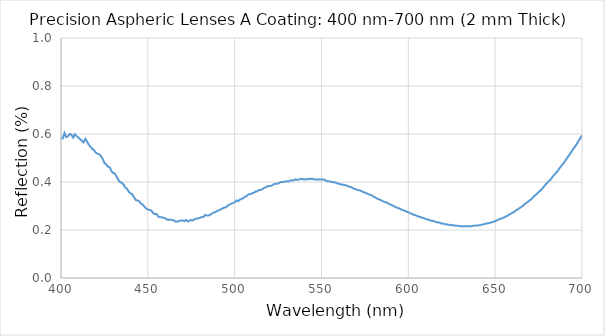
| Category | Reflection |
|---|---|
| 700.0 | 0.594 |
| 699.0 | 0.582 |
| 698.0 | 0.571 |
| 697.0 | 0.558 |
| 696.0 | 0.548 |
| 695.0 | 0.538 |
| 694.0 | 0.527 |
| 693.0 | 0.516 |
| 692.0 | 0.506 |
| 691.0 | 0.496 |
| 690.0 | 0.484 |
| 689.0 | 0.475 |
| 688.0 | 0.466 |
| 687.0 | 0.457 |
| 686.0 | 0.446 |
| 685.0 | 0.438 |
| 684.0 | 0.43 |
| 683.0 | 0.421 |
| 682.0 | 0.411 |
| 681.0 | 0.404 |
| 680.0 | 0.397 |
| 679.0 | 0.389 |
| 678.0 | 0.38 |
| 677.0 | 0.372 |
| 676.0 | 0.364 |
| 675.0 | 0.358 |
| 674.0 | 0.35 |
| 673.0 | 0.345 |
| 672.0 | 0.337 |
| 671.0 | 0.33 |
| 670.0 | 0.324 |
| 669.0 | 0.318 |
| 668.0 | 0.313 |
| 667.0 | 0.308 |
| 666.0 | 0.301 |
| 665.0 | 0.296 |
| 664.0 | 0.291 |
| 663.0 | 0.286 |
| 662.0 | 0.282 |
| 661.0 | 0.276 |
| 660.0 | 0.272 |
| 659.0 | 0.268 |
| 658.0 | 0.264 |
| 657.0 | 0.259 |
| 656.0 | 0.256 |
| 655.0 | 0.252 |
| 654.0 | 0.249 |
| 653.0 | 0.246 |
| 652.0 | 0.244 |
| 651.0 | 0.24 |
| 650.0 | 0.237 |
| 649.0 | 0.234 |
| 648.0 | 0.232 |
| 647.0 | 0.23 |
| 646.0 | 0.228 |
| 645.0 | 0.227 |
| 644.0 | 0.225 |
| 643.0 | 0.223 |
| 642.0 | 0.222 |
| 641.0 | 0.22 |
| 640.0 | 0.219 |
| 639.0 | 0.219 |
| 638.0 | 0.218 |
| 637.0 | 0.217 |
| 636.0 | 0.216 |
| 635.0 | 0.216 |
| 634.0 | 0.216 |
| 633.0 | 0.216 |
| 632.0 | 0.216 |
| 631.0 | 0.216 |
| 630.0 | 0.216 |
| 629.0 | 0.217 |
| 628.0 | 0.218 |
| 627.0 | 0.218 |
| 626.0 | 0.22 |
| 625.0 | 0.22 |
| 624.0 | 0.221 |
| 623.0 | 0.222 |
| 622.0 | 0.224 |
| 621.0 | 0.224 |
| 620.0 | 0.227 |
| 619.0 | 0.227 |
| 618.0 | 0.231 |
| 617.0 | 0.231 |
| 616.0 | 0.233 |
| 615.0 | 0.236 |
| 614.0 | 0.238 |
| 613.0 | 0.239 |
| 612.0 | 0.242 |
| 611.0 | 0.244 |
| 610.0 | 0.246 |
| 609.0 | 0.249 |
| 608.0 | 0.251 |
| 607.0 | 0.254 |
| 606.0 | 0.256 |
| 605.0 | 0.258 |
| 604.0 | 0.262 |
| 603.0 | 0.264 |
| 602.0 | 0.267 |
| 601.0 | 0.27 |
| 600.0 | 0.274 |
| 599.0 | 0.276 |
| 598.0 | 0.28 |
| 597.0 | 0.282 |
| 596.0 | 0.285 |
| 595.0 | 0.289 |
| 594.0 | 0.292 |
| 593.0 | 0.294 |
| 592.0 | 0.298 |
| 591.0 | 0.302 |
| 590.0 | 0.305 |
| 589.0 | 0.308 |
| 588.0 | 0.313 |
| 587.0 | 0.315 |
| 586.0 | 0.318 |
| 585.0 | 0.321 |
| 584.0 | 0.325 |
| 583.0 | 0.328 |
| 582.0 | 0.331 |
| 581.0 | 0.335 |
| 580.0 | 0.339 |
| 579.0 | 0.344 |
| 578.0 | 0.347 |
| 577.0 | 0.349 |
| 576.0 | 0.353 |
| 575.0 | 0.356 |
| 574.0 | 0.358 |
| 573.0 | 0.362 |
| 572.0 | 0.365 |
| 571.0 | 0.366 |
| 570.0 | 0.369 |
| 569.0 | 0.371 |
| 568.0 | 0.375 |
| 567.0 | 0.379 |
| 566.0 | 0.38 |
| 565.0 | 0.384 |
| 564.0 | 0.386 |
| 563.0 | 0.387 |
| 562.0 | 0.39 |
| 561.0 | 0.39 |
| 560.0 | 0.393 |
| 559.0 | 0.394 |
| 558.0 | 0.398 |
| 557.0 | 0.399 |
| 556.0 | 0.4 |
| 555.0 | 0.402 |
| 554.0 | 0.403 |
| 553.0 | 0.404 |
| 552.0 | 0.409 |
| 551.0 | 0.41 |
| 550.0 | 0.41 |
| 549.0 | 0.411 |
| 548.0 | 0.41 |
| 547.0 | 0.411 |
| 546.0 | 0.41 |
| 545.0 | 0.413 |
| 544.0 | 0.412 |
| 543.0 | 0.414 |
| 542.0 | 0.411 |
| 541.0 | 0.412 |
| 540.0 | 0.41 |
| 539.0 | 0.412 |
| 538.0 | 0.413 |
| 537.0 | 0.41 |
| 536.0 | 0.409 |
| 535.0 | 0.411 |
| 534.0 | 0.407 |
| 533.0 | 0.407 |
| 532.0 | 0.406 |
| 531.0 | 0.402 |
| 530.0 | 0.403 |
| 529.0 | 0.402 |
| 528.0 | 0.4 |
| 527.0 | 0.4 |
| 526.0 | 0.398 |
| 525.0 | 0.393 |
| 524.0 | 0.393 |
| 523.0 | 0.392 |
| 522.0 | 0.388 |
| 521.0 | 0.384 |
| 520.0 | 0.383 |
| 519.0 | 0.383 |
| 518.0 | 0.378 |
| 517.0 | 0.376 |
| 516.0 | 0.37 |
| 515.0 | 0.367 |
| 514.0 | 0.367 |
| 513.0 | 0.361 |
| 512.0 | 0.36 |
| 511.0 | 0.355 |
| 510.0 | 0.353 |
| 509.0 | 0.349 |
| 508.0 | 0.349 |
| 507.0 | 0.342 |
| 506.0 | 0.339 |
| 505.0 | 0.333 |
| 504.0 | 0.329 |
| 503.0 | 0.327 |
| 502.0 | 0.32 |
| 501.0 | 0.323 |
| 500.0 | 0.316 |
| 499.0 | 0.312 |
| 498.0 | 0.309 |
| 497.0 | 0.306 |
| 496.0 | 0.301 |
| 495.0 | 0.295 |
| 494.0 | 0.293 |
| 493.0 | 0.29 |
| 492.0 | 0.286 |
| 491.0 | 0.282 |
| 490.0 | 0.28 |
| 489.0 | 0.275 |
| 488.0 | 0.273 |
| 487.0 | 0.269 |
| 486.0 | 0.264 |
| 485.0 | 0.261 |
| 484.0 | 0.26 |
| 483.0 | 0.263 |
| 482.0 | 0.254 |
| 481.0 | 0.254 |
| 480.0 | 0.251 |
| 479.0 | 0.248 |
| 478.0 | 0.248 |
| 477.0 | 0.245 |
| 476.0 | 0.24 |
| 475.0 | 0.242 |
| 474.0 | 0.239 |
| 473.0 | 0.236 |
| 472.0 | 0.242 |
| 471.0 | 0.237 |
| 470.0 | 0.24 |
| 469.0 | 0.24 |
| 468.0 | 0.237 |
| 467.0 | 0.235 |
| 466.0 | 0.235 |
| 465.0 | 0.24 |
| 464.0 | 0.241 |
| 463.0 | 0.244 |
| 462.0 | 0.242 |
| 461.0 | 0.243 |
| 460.0 | 0.249 |
| 459.0 | 0.251 |
| 458.0 | 0.253 |
| 457.0 | 0.253 |
| 456.0 | 0.256 |
| 455.0 | 0.267 |
| 454.0 | 0.266 |
| 453.0 | 0.271 |
| 452.0 | 0.281 |
| 451.0 | 0.284 |
| 450.0 | 0.285 |
| 449.0 | 0.29 |
| 448.0 | 0.298 |
| 447.0 | 0.306 |
| 446.0 | 0.31 |
| 445.0 | 0.32 |
| 444.0 | 0.323 |
| 443.0 | 0.325 |
| 442.0 | 0.337 |
| 441.0 | 0.349 |
| 440.0 | 0.353 |
| 439.0 | 0.36 |
| 438.0 | 0.372 |
| 437.0 | 0.377 |
| 436.0 | 0.39 |
| 435.0 | 0.396 |
| 434.0 | 0.4 |
| 433.0 | 0.409 |
| 432.0 | 0.422 |
| 431.0 | 0.436 |
| 430.0 | 0.437 |
| 429.0 | 0.446 |
| 428.0 | 0.462 |
| 427.0 | 0.464 |
| 426.0 | 0.473 |
| 425.0 | 0.48 |
| 424.0 | 0.496 |
| 423.0 | 0.509 |
| 422.0 | 0.515 |
| 421.0 | 0.518 |
| 420.0 | 0.523 |
| 419.0 | 0.533 |
| 418.0 | 0.538 |
| 417.0 | 0.547 |
| 416.0 | 0.555 |
| 415.0 | 0.568 |
| 414.0 | 0.58 |
| 413.0 | 0.565 |
| 412.0 | 0.572 |
| 411.0 | 0.579 |
| 410.0 | 0.585 |
| 409.0 | 0.591 |
| 408.0 | 0.599 |
| 407.0 | 0.585 |
| 406.0 | 0.597 |
| 405.0 | 0.6 |
| 404.0 | 0.59 |
| 403.0 | 0.587 |
| 402.0 | 0.604 |
| 401.0 | 0.582 |
| 400.0 | 0.583 |
| 399.0 | 0.583 |
| 398.0 | 0.561 |
| 397.0 | 0.557 |
| 396.0 | 0.552 |
| 395.0 | 0.554 |
| 394.0 | 0.536 |
| 393.0 | 0.511 |
| 392.0 | 0.506 |
| 391.0 | 0.512 |
| 390.0 | 0.475 |
| 389.0 | 0.485 |
| 388.0 | 0.452 |
| 387.0 | 0.437 |
| 386.0 | 0.404 |
| 385.0 | 0.412 |
| 384.0 | 0.383 |
| 383.0 | 0.358 |
| 382.0 | 0.358 |
| 381.0 | 0.319 |
| 380.0 | 0.288 |
| 379.0 | 0.31 |
| 378.0 | 0.225 |
| 377.0 | 0.234 |
| 376.0 | 0.183 |
| 375.0 | 0.202 |
| 374.0 | 0.157 |
| 373.0 | 0.182 |
| 372.0 | 0.15 |
| 371.0 | 0.081 |
| 370.0 | 0.145 |
| 369.0 | 0.087 |
| 368.0 | 0.104 |
| 367.0 | 0.07 |
| 366.0 | 0.09 |
| 365.0 | 0.098 |
| 364.0 | 0.128 |
| 363.0 | 0.101 |
| 362.0 | 0.156 |
| 361.0 | 0.182 |
| 360.0 | 0.236 |
| 359.0 | 0.25 |
| 358.0 | 0.338 |
| 357.0 | 0.38 |
| 356.0 | 0.441 |
| 355.0 | 0.59 |
| 354.0 | 0.669 |
| 353.0 | 0.739 |
| 352.0 | 0.898 |
| 351.0 | 0.993 |
| 350.0 | 1.165 |